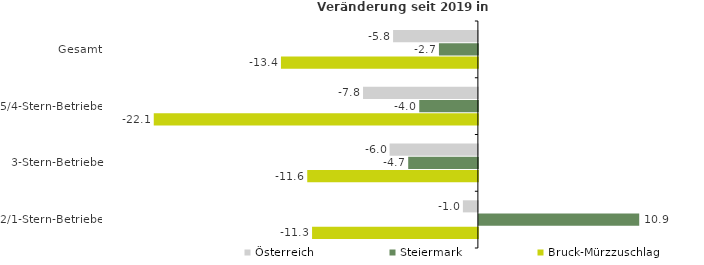
| Category | Österreich | Steiermark | Bruck-Mürzzuschlag |
|---|---|---|---|
| Gesamt | -5.779 | -2.653 | -13.419 |
| 5/4-Stern-Betriebe | -7.825 | -3.996 | -22.086 |
| 3-Stern-Betriebe | -6.014 | -4.748 | -11.628 |
| 2/1-Stern-Betriebe | -1.021 | 10.926 | -11.299 |